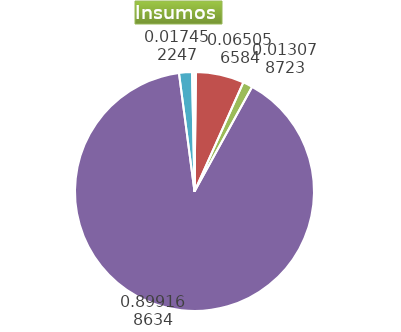
| Category | Series 0 |
|---|---|
| Control arvenses | 512580 |
| Control fitosanitario | 17118236 |
| Cosecha y beneficio | 3441383.596 |
| Fertilización | 236596821 |
| Instalación | 4592182.27 |
| Otros | 867216 |
| Podas | 0 |
| Riego | 0 |
| Transporte | 0 |
| Tutorado | 0 |